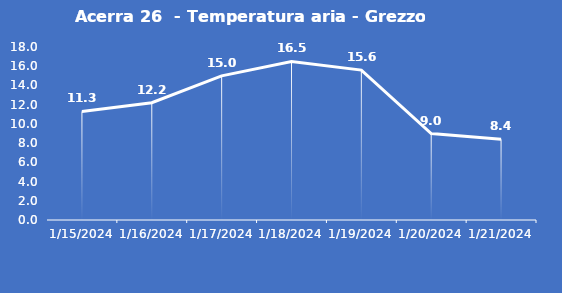
| Category | Acerra 26  - Temperatura aria - Grezzo (°C) |
|---|---|
| 1/15/24 | 11.3 |
| 1/16/24 | 12.2 |
| 1/17/24 | 15 |
| 1/18/24 | 16.5 |
| 1/19/24 | 15.6 |
| 1/20/24 | 9 |
| 1/21/24 | 8.4 |